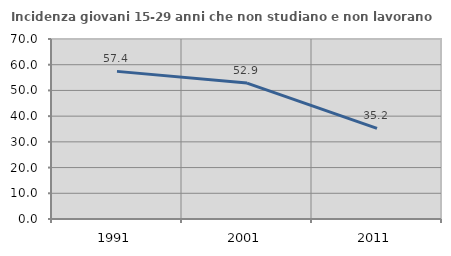
| Category | Incidenza giovani 15-29 anni che non studiano e non lavorano  |
|---|---|
| 1991.0 | 57.41 |
| 2001.0 | 52.857 |
| 2011.0 | 35.238 |